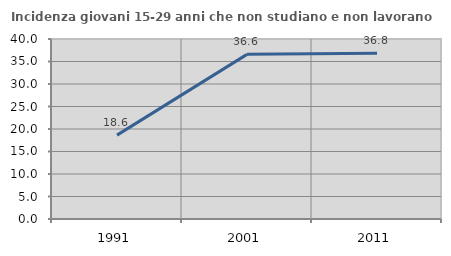
| Category | Incidenza giovani 15-29 anni che non studiano e non lavorano  |
|---|---|
| 1991.0 | 18.635 |
| 2001.0 | 36.585 |
| 2011.0 | 36.842 |